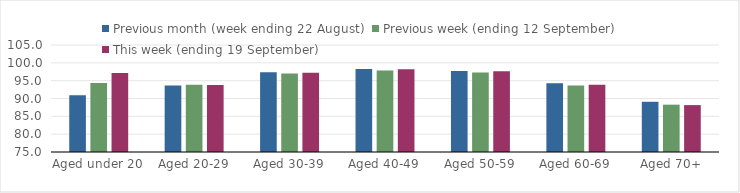
| Category | Previous month (week ending 22 August) | Previous week (ending 12 September) | This week (ending 19 September) |
|---|---|---|---|
| Aged under 20 | 90.93 | 94.35 | 97.18 |
| Aged 20-29 | 93.61 | 93.85 | 93.78 |
| Aged 30-39 | 97.37 | 97.03 | 97.21 |
| Aged 40-49 | 98.24 | 97.85 | 98.23 |
| Aged 50-59 | 97.74 | 97.28 | 97.64 |
| Aged 60-69 | 94.26 | 93.67 | 93.85 |
| Aged 70+ | 89.08 | 88.27 | 88.15 |